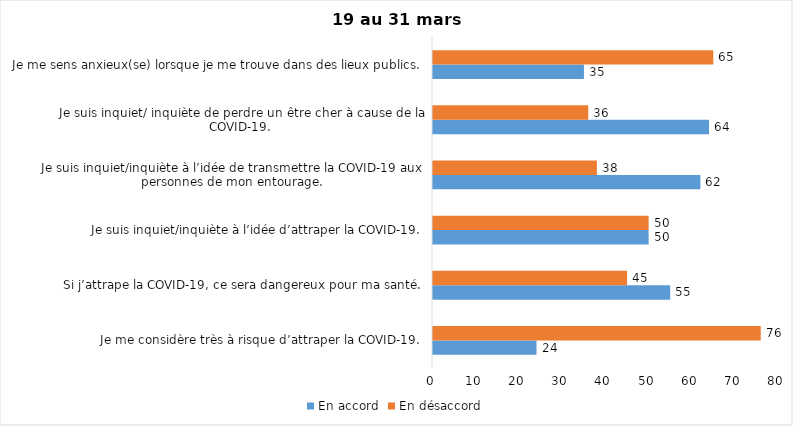
| Category | En accord | En désaccord |
|---|---|---|
| Je me considère très à risque d’attraper la COVID-19. | 24 | 76 |
| Si j’attrape la COVID-19, ce sera dangereux pour ma santé. | 55 | 45 |
| Je suis inquiet/inquiète à l’idée d’attraper la COVID-19. | 50 | 50 |
| Je suis inquiet/inquiète à l’idée de transmettre la COVID-19 aux personnes de mon entourage. | 62 | 38 |
| Je suis inquiet/ inquiète de perdre un être cher à cause de la COVID-19. | 64 | 36 |
| Je me sens anxieux(se) lorsque je me trouve dans des lieux publics. | 35 | 65 |